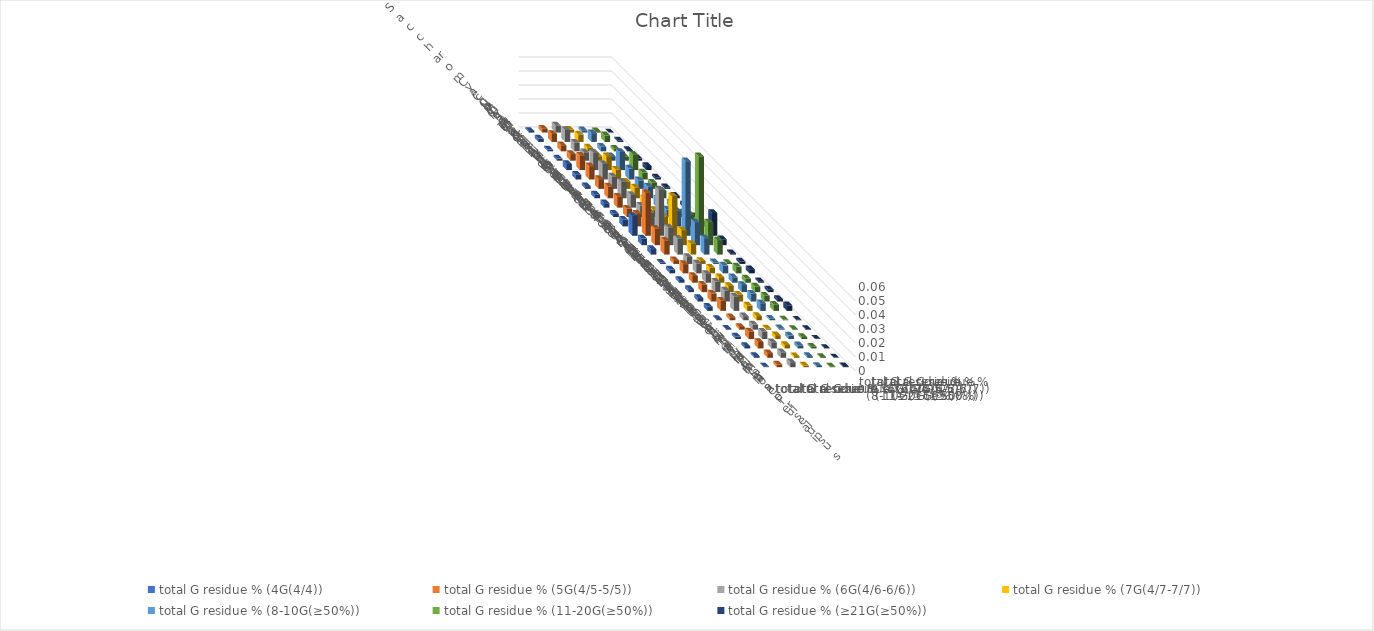
| Category | total G residue % (4G(4/4)) | total G residue % (5G(4/5-5/5)) | total G residue % (6G(4/6-6/6)) | total G residue % (7G(4/7-7/7)) | total G residue % (8-10G(≥50%)) | total G residue % (11-20G(≥50%)) | total G residue % (≥21G(≥50%)) |
|---|---|---|---|---|---|---|---|
| Saccharomyces cerevisiae S288c | 0.001 | 0.003 | 0.005 | 0.002 | 0.002 | 0.001 | 0 |
| Candida albicans | 0.002 | 0.006 | 0.009 | 0.005 | 0.006 | 0.005 | 0.001 |
| Candida auris | 0.001 | 0.004 | 0.006 | 0.003 | 0.003 | 0.002 | 0.001 |
| Candida tropicalis | 0.002 | 0.005 | 0.006 | 0.003 | 0.003 | 0.003 | 0.002 |
| Neurospora crassa | 0.004 | 0.01 | 0.013 | 0.01 | 0.013 | 0.011 | 0.003 |
| Magnaporthe oryzae | 0.003 | 0.009 | 0.011 | 0.007 | 0.008 | 0.005 | 0.001 |
| Trichoderma reesei | 0.002 | 0.007 | 0.009 | 0.005 | 0.006 | 0.004 | 0.001 |
| Cryptococcus neoformans | 0.003 | 0.008 | 0.012 | 0.008 | 0.008 | 0.005 | 0.002 |
| Ustilago maydis | 0.003 | 0.008 | 0.009 | 0.006 | 0.006 | 0.004 | 0.002 |
| Taiwanofungus camphoratus | 0.002 | 0.006 | 0.008 | 0.005 | 0.005 | 0.003 | 0.001 |
| Dictyostelium discoideum | 0.005 | 0.009 | 0.01 | 0.007 | 0.011 | 0.008 | 0.001 |
| Chlamydomonas reinhardtii | 0.014 | 0.031 | 0.033 | 0.028 | 0.053 | 0.057 | 0.016 |
| Drosophila melanogaster | 0.005 | 0.012 | 0.013 | 0.011 | 0.016 | 0.016 | 0.004 |
| Aedes aegypti | 0.004 | 0.01 | 0.011 | 0.008 | 0.012 | 0.01 | 0.001 |
| Plasmodium falciparum | 0.001 | 0.003 | 0.005 | 0.002 | 0.001 | 0.001 | 0.002 |
| Caenorhabditis elegans | 0.003 | 0.007 | 0.007 | 0.004 | 0.006 | 0.005 | 0.003 |
| Danio rerio | 0.002 | 0.005 | 0.006 | 0.004 | 0.004 | 0.003 | 0.001 |
| Mus musculus | 0.002 | 0.005 | 0.007 | 0.004 | 0.005 | 0.004 | 0.002 |
| Homo sapiens | 0.002 | 0.006 | 0.008 | 0.005 | 0.006 | 0.004 | 0.002 |
| Arabidopsis thaliana | 0.003 | 0.007 | 0.01 | 0.004 | 0.006 | 0.004 | 0.004 |
| Tetrahymena thermophila | 0.001 | 0.002 | 0.003 | 0.003 | 0.001 | 0.001 | 0 |
| Paramecium tetraurelia | 0.001 | 0.002 | 0.004 | 0.001 | 0.001 | 0 | 0 |
| Oxytricha trifallax | 0.002 | 0.005 | 0.005 | 0.003 | 0.002 | 0.001 | 0 |
| Stylonychia lemnae | 0.002 | 0.005 | 0.004 | 0.002 | 0.002 | 0.001 | 0 |
| Pseudocohnilembus persalinus | 0.001 | 0.003 | 0.004 | 0.001 | 0.001 | 0.001 | 0 |
| Stentor coeruleus | 0.001 | 0.002 | 0.004 | 0.001 | 0.001 | 0.001 | 0.001 |